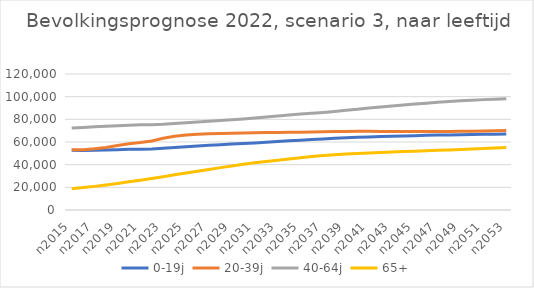
| Category | 0-19j | 20-39j | 40-64j | 65+ |
|---|---|---|---|---|
| n2015 | 52620 | 53075 | 72402 | 18838 |
| n2016 | 52467 | 53236 | 72826 | 19773 |
| n2017 | 52646 | 54074 | 73358 | 20842 |
| n2018 | 52859 | 55229 | 73877 | 22066 |
| n2019 | 53196 | 56878 | 74389 | 23435 |
| n2020 | 53577 | 58541 | 74834 | 24892 |
| n2021 | 53611 | 59548 | 75207 | 26345 |
| n2022 | 53854 | 60864 | 75289 | 27795 |
| n2023 | 54532 | 63299 | 75594 | 29419 |
| n2024 | 55199 | 65107 | 76386 | 31019 |
| n2025 | 55863 | 66150 | 77083 | 32589 |
| n2026 | 56501 | 66908 | 77690 | 34141 |
| n2027 | 57080 | 67256 | 78274 | 35803 |
| n2028 | 57637 | 67595 | 78866 | 37388 |
| n2029 | 58191 | 67804 | 79619 | 38888 |
| n2030 | 58711 | 68044 | 80353 | 40333 |
| n2031 | 59210 | 68219 | 81202 | 41656 |
| n2032 | 59805 | 68321 | 82096 | 42859 |
| n2033 | 60378 | 68473 | 82993 | 43949 |
| n2034 | 61032 | 68551 | 83867 | 44990 |
| n2035 | 61602 | 68710 | 84632 | 46073 |
| n2036 | 62166 | 68872 | 85345 | 47121 |
| n2037 | 62699 | 69049 | 86127 | 48028 |
| n2038 | 63229 | 69198 | 87015 | 48778 |
| n2039 | 63723 | 69343 | 88000 | 49384 |
| n2040 | 64136 | 69548 | 88997 | 49907 |
| n2041 | 64516 | 69382 | 90000 | 50358 |
| n2042 | 64811 | 69279 | 90950 | 50782 |
| n2043 | 65110 | 69190 | 91865 | 51172 |
| n2044 | 65372 | 69158 | 92738 | 51528 |
| n2045 | 65608 | 69198 | 93530 | 51893 |
| n2046 | 65851 | 69178 | 94267 | 52324 |
| n2047 | 66077 | 69206 | 95034 | 52645 |
| n2048 | 66271 | 69284 | 95724 | 52999 |
| n2049 | 66455 | 69404 | 96315 | 53394 |
| n2050 | 66615 | 69556 | 96851 | 53805 |
| n2051 | 66767 | 69705 | 97391 | 54202 |
| n2052 | 66888 | 69906 | 97800 | 54686 |
| n2053 | 66996 | 70147 | 98180 | 55163 |